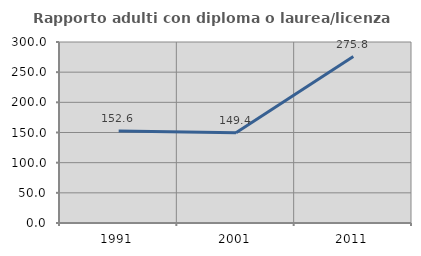
| Category | Rapporto adulti con diploma o laurea/licenza media  |
|---|---|
| 1991.0 | 152.632 |
| 2001.0 | 149.425 |
| 2011.0 | 275.806 |